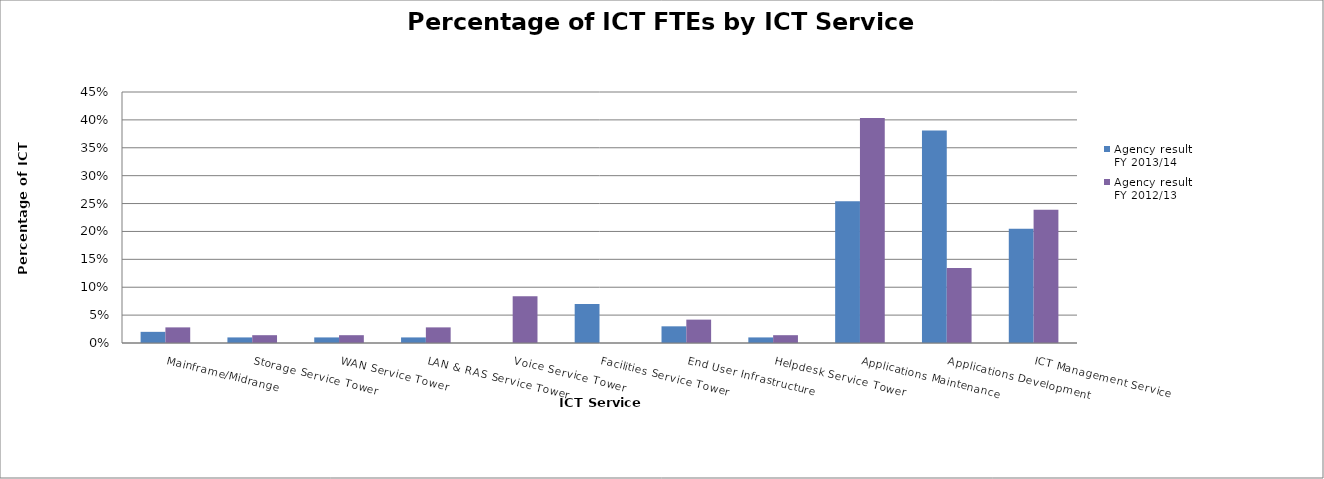
| Category | Agency result 
FY 2013/14 | Agency result 
FY 2012/13 |
|---|---|---|
| Mainframe/Midrange | 0.02 | 0.028 |
| Storage Service Tower | 0.01 | 0.014 |
| WAN Service Tower | 0.01 | 0.014 |
| LAN & RAS Service Tower | 0.01 | 0.028 |
| Voice Service Tower | 0 | 0.084 |
| Facilities Service Tower | 0.07 | 0 |
| End User Infrastructure | 0.03 | 0.042 |
| Helpdesk Service Tower | 0.01 | 0.014 |
| Applications Maintenance | 0.254 | 0.403 |
| Applications Development | 0.381 | 0.134 |
| ICT Management Service | 0.205 | 0.239 |